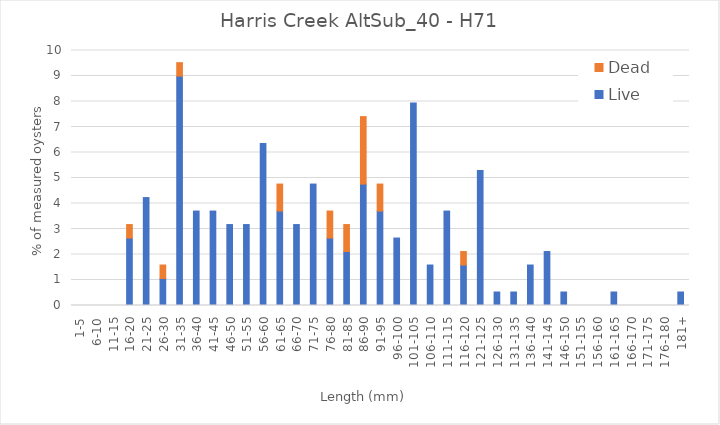
| Category | Live | Dead |
|---|---|---|
| 1-5 | 0 | 0 |
| 6-10 | 0 | 0 |
| 11-15 | 0 | 0 |
| 16-20 | 2.646 | 0.529 |
| 21-25 | 4.233 | 0 |
| 26-30 | 1.058 | 0.529 |
| 31-35 | 8.995 | 0.529 |
| 36-40 | 3.704 | 0 |
| 41-45 | 3.704 | 0 |
| 46-50 | 3.175 | 0 |
| 51-55 | 3.175 | 0 |
| 56-60 | 6.349 | 0 |
| 61-65 | 3.704 | 1.058 |
| 66-70 | 3.175 | 0 |
| 71-75 | 4.762 | 0 |
| 76-80 | 2.646 | 1.058 |
| 81-85 | 2.116 | 1.058 |
| 86-90 | 4.762 | 2.646 |
| 91-95 | 3.704 | 1.058 |
| 96-100 | 2.646 | 0 |
| 101-105 | 7.937 | 0 |
| 106-110 | 1.587 | 0 |
| 111-115 | 3.704 | 0 |
| 116-120 | 1.587 | 0.529 |
| 121-125 | 5.291 | 0 |
| 126-130 | 0.529 | 0 |
| 131-135 | 0.529 | 0 |
| 136-140 | 1.587 | 0 |
| 141-145 | 2.116 | 0 |
| 146-150 | 0.529 | 0 |
| 151-155 | 0 | 0 |
| 156-160 | 0 | 0 |
| 161-165 | 0.529 | 0 |
| 166-170 | 0 | 0 |
| 171-175 | 0 | 0 |
| 176-180 | 0 | 0 |
| 181+ | 0.529 | 0 |